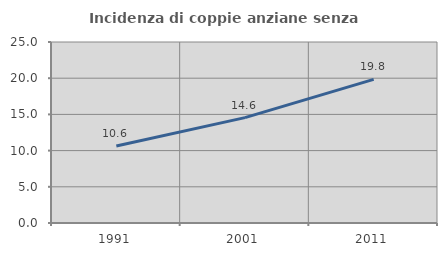
| Category | Incidenza di coppie anziane senza figli  |
|---|---|
| 1991.0 | 10.629 |
| 2001.0 | 14.553 |
| 2011.0 | 19.832 |